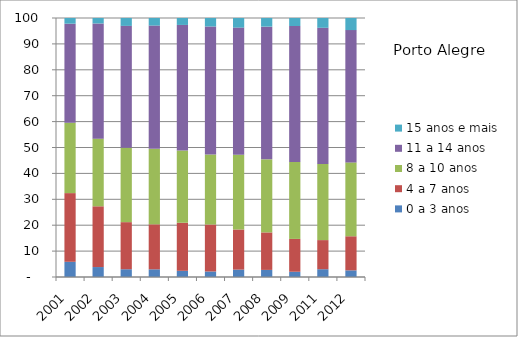
| Category | 0 a 3 anos | 4 a 7 anos | 8 a 10 anos | 11 a 14 anos | 15 anos e mais |
|---|---|---|---|---|---|
| 2001.0 | 5.87 | 26.52 | 27.18 | 38.23 | 2.19 |
| 2002.0 | 3.84 | 23.46 | 26.12 | 44.47 | 2.11 |
| 2003.0 | 3 | 18.18 | 28.7 | 47.08 | 3.04 |
| 2004.0 | 2.97 | 17.37 | 29.15 | 47.59 | 2.92 |
| 2005.0 | 2.39 | 18.55 | 27.89 | 48.49 | 2.68 |
| 2006.0 | 2.13 | 18.13 | 26.99 | 49.47 | 3.28 |
| 2007.0 | 2.85 | 15.49 | 28.85 | 49.1 | 3.71 |
| 2008.0 | 2.74 | 14.48 | 28.22 | 51.22 | 3.34 |
| 2009.0 | 2.03 | 12.68 | 29.73 | 52.46 | 3.1 |
| 2011.0 | 3.01 | 11.24 | 29.42 | 52.55 | 3.78 |
| 2012.0 | 2.57 | 13.16 | 28.52 | 51.08 | 4.67 |